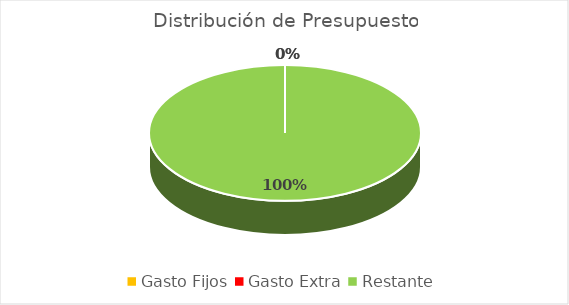
| Category | Series 0 |
|---|---|
| Gasto Fijos | 0 |
| Gasto Extra | 0 |
| Restante | 1 |